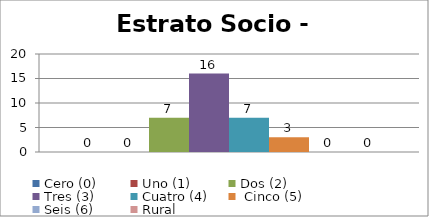
| Category | Cero (0) | Uno (1)   | Dos (2) | Tres (3) | Cuatro (4) |  Cinco (5) | Seis (6) | Rural |
|---|---|---|---|---|---|---|---|---|
| 0 | 0 | 0 | 7 | 16 | 7 | 3 | 0 | 0 |